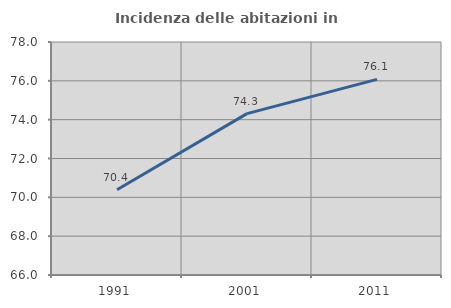
| Category | Incidenza delle abitazioni in proprietà  |
|---|---|
| 1991.0 | 70.393 |
| 2001.0 | 74.313 |
| 2011.0 | 76.077 |